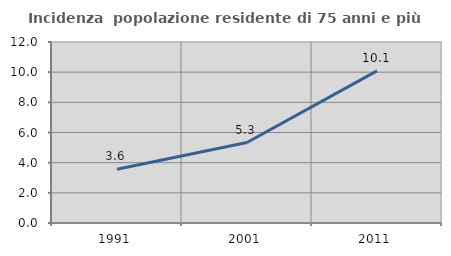
| Category | Incidenza  popolazione residente di 75 anni e più |
|---|---|
| 1991.0 | 3.56 |
| 2001.0 | 5.334 |
| 2011.0 | 10.089 |